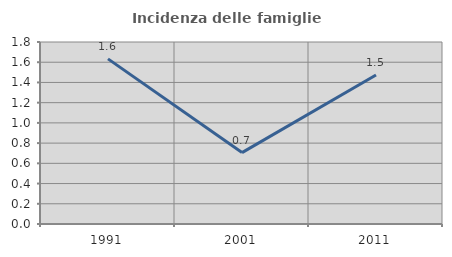
| Category | Incidenza delle famiglie numerose |
|---|---|
| 1991.0 | 1.633 |
| 2001.0 | 0.706 |
| 2011.0 | 1.474 |